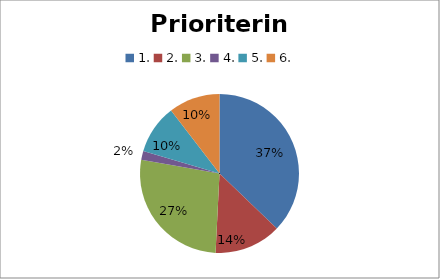
| Category | Series 0 |
|---|---|
| 1. | 164 |
| 2. | 60 |
| 3. | 119 |
| 4. | 8 |
| 5. | 44 |
| 6. | 46 |